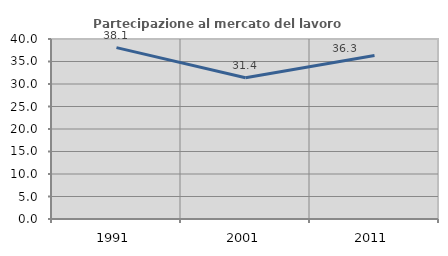
| Category | Partecipazione al mercato del lavoro  femminile |
|---|---|
| 1991.0 | 38.08 |
| 2001.0 | 31.4 |
| 2011.0 | 36.338 |